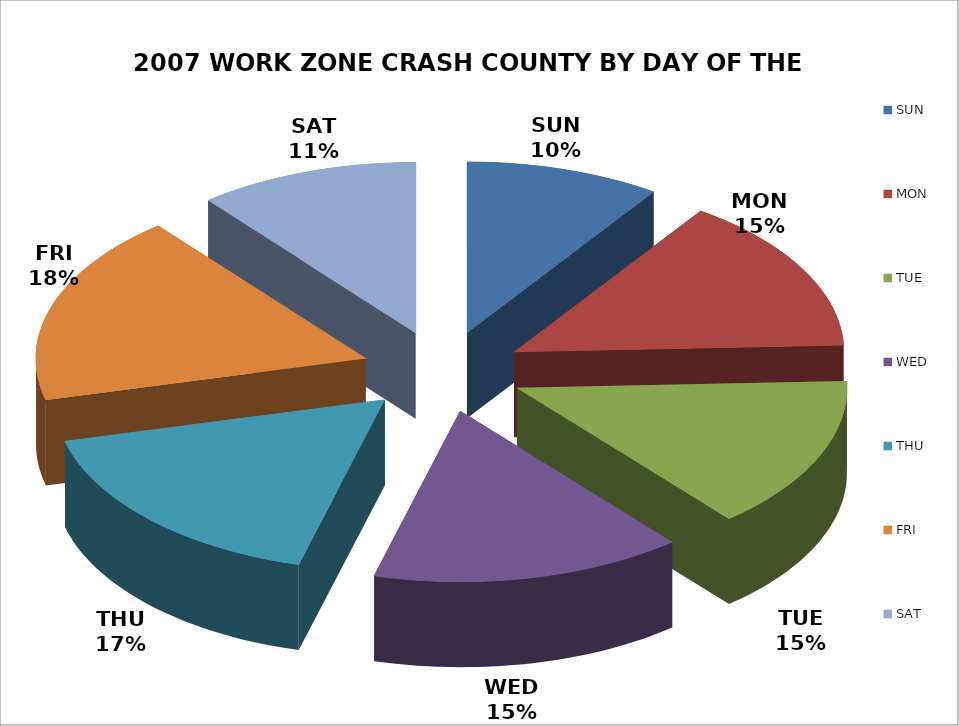
| Category | COUNT | % |
|---|---|---|
| SUN | 599 | 0.096 |
| MON | 926 | 0.148 |
| TUE | 909 | 0.145 |
| WED | 958 | 0.153 |
| THU | 1057 | 0.169 |
| FRI | 1131 | 0.181 |
| SAT | 678 | 0.108 |